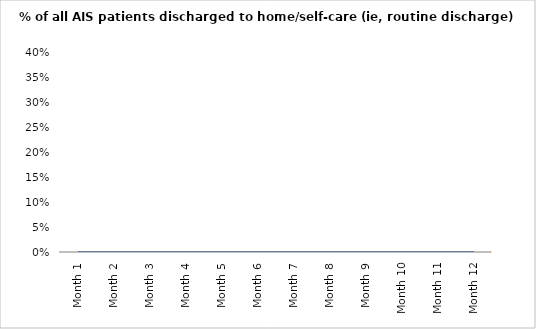
| Category | % of all AIS patients discharged to home/self-care (ie, routine discharge) |
|---|---|
| Month 1 | 0 |
| Month 2 | 0 |
| Month 3 | 0 |
| Month 4 | 0 |
| Month 5 | 0 |
| Month 6 | 0 |
| Month 7 | 0 |
| Month 8 | 0 |
| Month 9 | 0 |
| Month 10 | 0 |
| Month 11 | 0 |
| Month 12 | 0 |